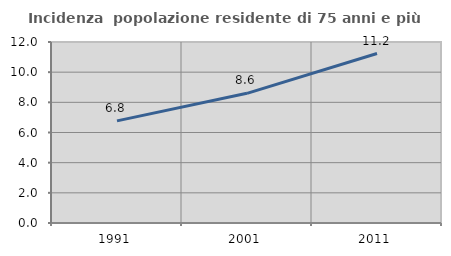
| Category | Incidenza  popolazione residente di 75 anni e più |
|---|---|
| 1991.0 | 6.77 |
| 2001.0 | 8.597 |
| 2011.0 | 11.235 |